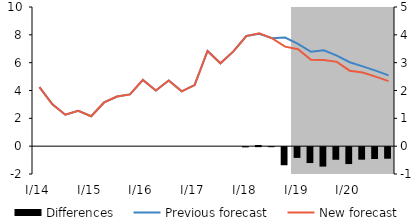
| Category | Differences |
|---|---|
| I/14 | 0 |
| II | 0 |
| III | 0 |
| IV | 0 |
| I/15 | 0 |
| II | 0 |
| III | 0 |
| IV | 0 |
| I/16 | 0 |
| II | 0 |
| III | 0 |
| IV | 0 |
| I/17 | 0 |
| II | 0 |
| III | 0 |
| IV | 0 |
| I/18 | -0.008 |
| II | 0.041 |
| III | -0.001 |
| IV | -0.649 |
| I/19 | -0.386 |
| II | -0.57 |
| III | -0.699 |
| IV | -0.452 |
| I/20 | -0.607 |
| II | -0.449 |
| III | -0.426 |
| IV | -0.415 |